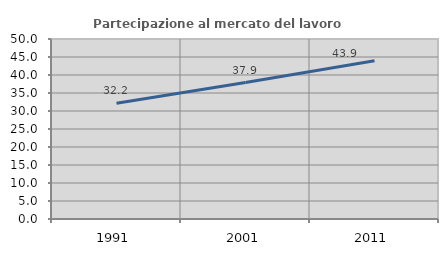
| Category | Partecipazione al mercato del lavoro  femminile |
|---|---|
| 1991.0 | 32.151 |
| 2001.0 | 37.907 |
| 2011.0 | 43.943 |